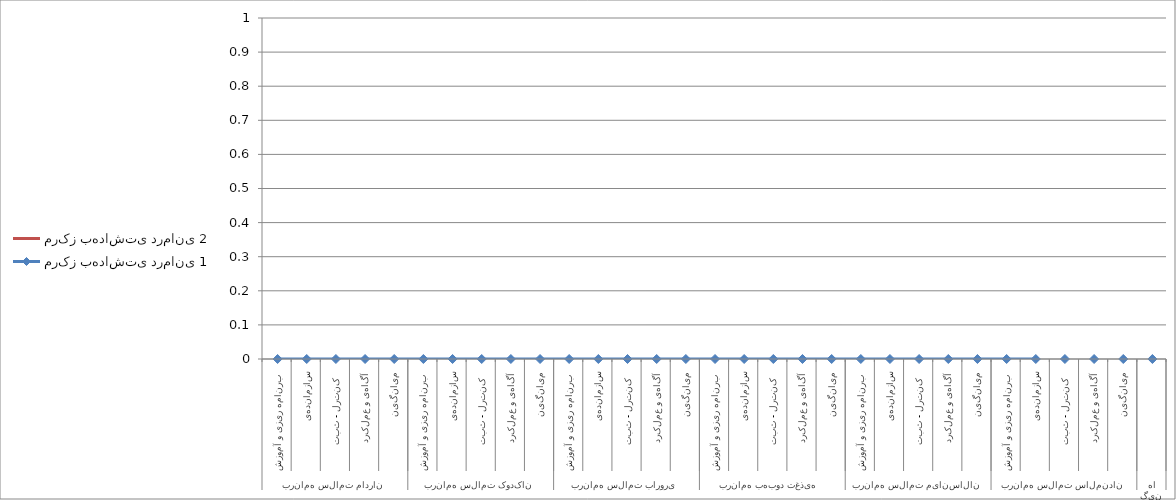
| Category | مرکز بهداشتی درمانی 1 | مرکز بهداشتی درمانی 2 |
|---|---|---|
| 0 | 0 | 0 |
| 1 | 0 | 0 |
| 2 | 0 | 0 |
| 3 | 0 | 0 |
| 4 | 0 | 0 |
| 5 | 0 | 0 |
| 6 | 0 | 0 |
| 7 | 0 | 0 |
| 8 | 0 | 0 |
| 9 | 0 | 0 |
| 10 | 0 | 0 |
| 11 | 0 | 0 |
| 12 | 0 | 0 |
| 13 | 0 | 0 |
| 14 | 0 | 0 |
| 15 | 0 | 0 |
| 16 | 0 | 0 |
| 17 | 0 | 0 |
| 18 | 0 | 0 |
| 19 | 0 | 0 |
| 20 | 0 | 0 |
| 21 | 0 | 0 |
| 22 | 0 | 0 |
| 23 | 0 | 0 |
| 24 | 0 | 0 |
| 25 | 0 | 0 |
| 26 | 0 | 0 |
| 27 | 0 | 0 |
| 28 | 0 | 0 |
| 29 | 0 | 0 |
| 30 | 0 | 0 |